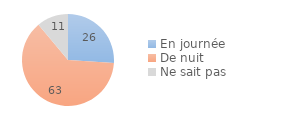
| Category | Series 0 |
|---|---|
| En journée | 26.037 |
| De nuit | 62.885 |
| Ne sait pas | 11.078 |